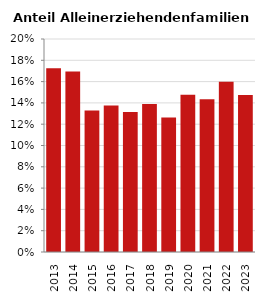
| Category | Anteil Alleinerziehende an Familien |
|---|---|
| 2013.0 | 0.173 |
| 2014.0 | 0.169 |
| 2015.0 | 0.133 |
| 2016.0 | 0.138 |
| 2017.0 | 0.131 |
| 2018.0 | 0.139 |
| 2019.0 | 0.126 |
| 2020.0 | 0.148 |
| 2021.0 | 0.143 |
| 2022.0 | 0.16 |
| 2023.0 | 0.147 |